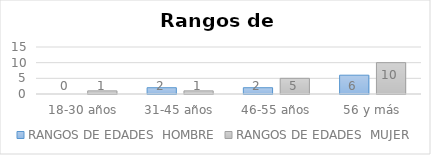
| Category | RANGOS DE EDADES  |
|---|---|
| 18-30 años | 1 |
| 31-45 años | 1 |
| 46-55 años | 5 |
| 56 y más | 10 |